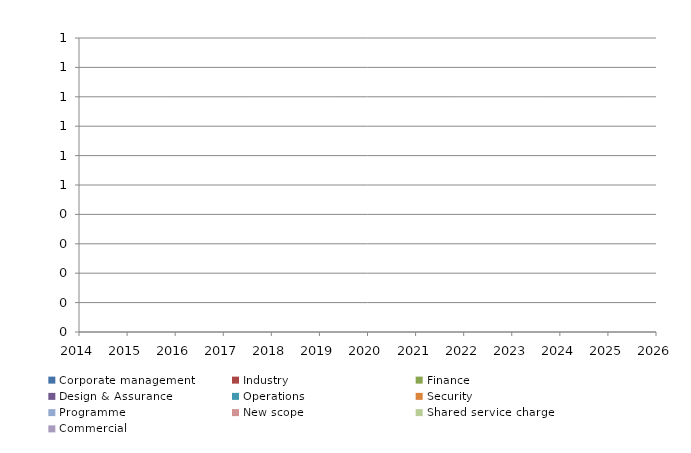
| Category | Corporate management | Industry | Finance | Design & Assurance | Operations  | Security | Programme | New scope | Shared service charge | Commercial |
|---|---|---|---|---|---|---|---|---|---|---|
| 2014.0 | 0 | 0 | 0 | 0 | 0 | 0 | 0 | 0 | 0 | 0 |
| 2015.0 | 0 | 0 | 0 | 0 | 0 | 0 | 0 | 0 | 0 | 0 |
| 2016.0 | 0 | 0 | 0 | 0 | 0 | 0 | 0 | 0 | 0 | 0 |
| 2017.0 | 0 | 0 | 0 | 0 | 0 | 0 | 0 | 0 | 0 | 0 |
| 2018.0 | 0 | 0 | 0 | 0 | 0 | 0 | 0 | 0 | 0 | 0 |
| 2019.0 | 0 | 0 | 0 | 0 | 0 | 0 | 0 | 0 | 0 | 0 |
| 2020.0 | 0 | 0 | 0 | 0 | 0 | 0 | 0 | 0 | 0 | 0 |
| 2021.0 | 0 | 0 | 0 | 0 | 0 | 0 | 0 | 0 | 0 | 0 |
| 2022.0 | 0 | 0 | 0 | 0 | 0 | 0 | 0 | 0 | 0 | 0 |
| 2023.0 | 0 | 0 | 0 | 0 | 0 | 0 | 0 | 0 | 0 | 0 |
| 2024.0 | 0 | 0 | 0 | 0 | 0 | 0 | 0 | 0 | 0 | 0 |
| 2025.0 | 0 | 0 | 0 | 0 | 0 | 0 | 0 | 0 | 0 | 0 |
| 2026.0 | 0 | 0 | 0 | 0 | 0 | 0 | 0 | 0 | 0 | 0 |